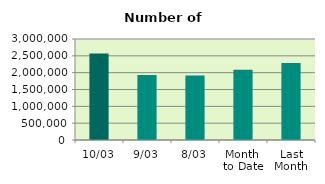
| Category | Series 0 |
|---|---|
| 10/03 | 2570544 |
| 9/03 | 1934300 |
| 8/03 | 1917742 |
| Month 
to Date | 2085565.5 |
| Last
Month | 2290810.7 |